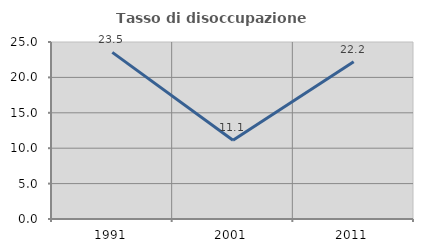
| Category | Tasso di disoccupazione giovanile  |
|---|---|
| 1991.0 | 23.529 |
| 2001.0 | 11.111 |
| 2011.0 | 22.222 |